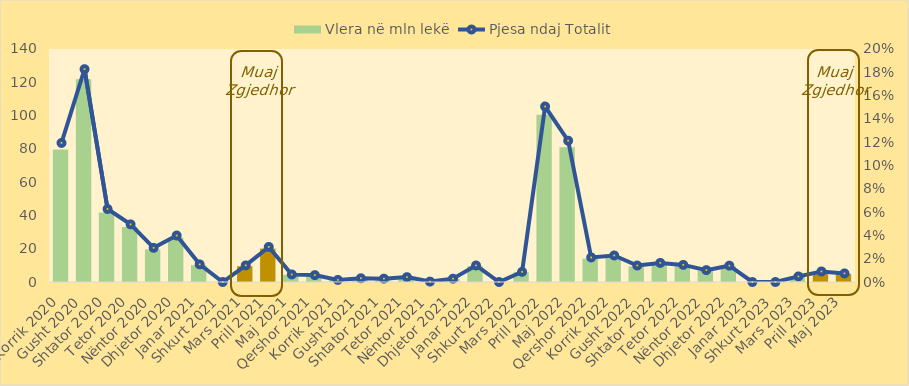
| Category | Vlera në mln lekë |
|---|---|
| Korrik 2020 | 79.6 |
| Gusht 2020 | 121.85 |
| Shtator 2020 | 41.8 |
| Tetor 2020 | 33 |
| Nëntor 2020 | 19.55 |
| Dhjetor 2020 | 26.602 |
| Janar 2021 | 10.1 |
| Shkurt 2021 | 0 |
| Mars 2021 | 9.5 |
| Prill 2021 | 20.08 |
| Maj 2021 | 4.325 |
| Qershor 2021 | 3.94 |
| Korrik 2021 | 1.2 |
| Gusht 2021 | 2.15 |
| Shtator 2021 | 1.925 |
| Tetor 2021 | 2.797 |
| Nëntor 2021 | 0.25 |
| Dhjetor 2021 | 1.9 |
| Janar 2022 | 9.461 |
| Shkurt 2022 | 0 |
| Mars 2022 | 5.822 |
| Prill 2022 | 100.459 |
| Maj 2022 | 80.899 |
| Qershor 2022 | 14.054 |
| Korrik 2022 | 15.189 |
| Gusht 2022 | 9.437 |
| Shtator 2022 | 10.931 |
| Tetor 2022 | 9.798 |
| Nëntor 2022 | 6.815 |
| Dhjetor 2022 | 9.352 |
| Janar 2023 | 0 |
| Shkurt 2023 | 0 |
| Mars 2023 | 3.197 |
| Prill 2023 | 6.037 |
| Maj 2023 | 4.919 |